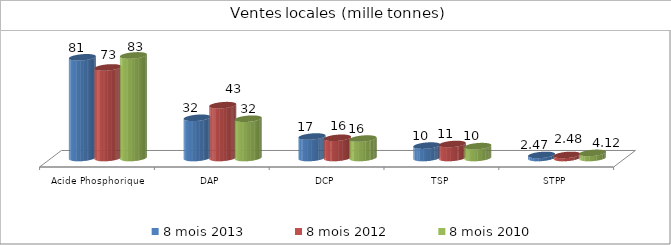
| Category | 8 mois 2013 | 8 mois 2012 | 8 mois 2010 |
|---|---|---|---|
| Acide Phosphorique 54% | 81.28 | 73.106 | 82.808 |
| DAP | 32.455 | 42.652 | 31.697 |
| DCP | 17.334 | 16.302 | 15.685 |
| TSP | 10.019 | 11.289 | 9.572 |
| STPP | 2.47 | 2.481 | 4.123 |